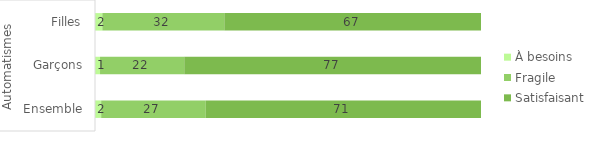
| Category | À besoins | Fragile | Satisfaisant |
|---|---|---|---|
| 0 | 1.6 | 27.1 | 71.3 |
| 1 | 1.3 | 21.8 | 76.8 |
| 2 | 1.9 | 31.6 | 66.5 |